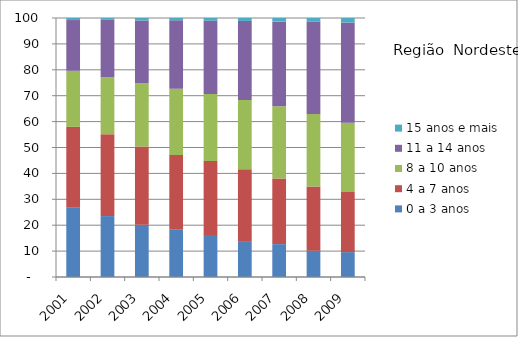
| Category | 0 a 3 anos | 4 a 7 anos | 8 a 10 anos | 11 a 14 anos | 15 anos e mais |
|---|---|---|---|---|---|
| 2001.0 | 26.72 | 31.25 | 21.65 | 19.59 | 0.79 |
| 2002.0 | 23.52 | 31.6 | 22.02 | 22.13 | 0.73 |
| 2003.0 | 20.16 | 30.22 | 24.48 | 24.19 | 0.95 |
| 2004.0 | 18.45 | 28.66 | 25.6 | 26.41 | 0.88 |
| 2005.0 | 16.26 | 28.56 | 25.8 | 28.38 | 1 |
| 2006.0 | 13.85 | 27.8 | 26.68 | 30.54 | 1.12 |
| 2007.0 | 12.7 | 25.29 | 27.94 | 32.66 | 1.41 |
| 2008.0 | 10.15 | 24.81 | 28 | 35.57 | 1.46 |
| 2009.0 | 9.61 | 23.22 | 26.73 | 38.72 | 1.73 |